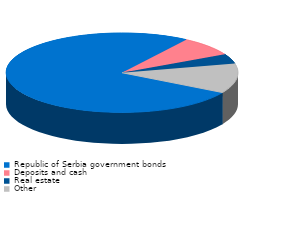
| Category | Series 0 |
|---|---|
| Republic of Serbia government bonds | 0.76 |
| Deposits and cash | 0.08 |
| Real estate | 0.04 |
| Other | 0.12 |